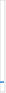
| Category | Caso | Resuelta | Pendiente |
|---|---|---|---|
| Quejas | 0 | 0 | 0 |
| Reclamaciones  | 3 | 3 | 0 |
| Sugerencias | 0 | 0 | 0 |
| Otras | 0 | 0 | 0 |
| Total | 3 | 3 | 0 |